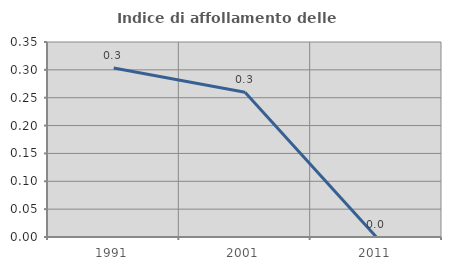
| Category | Indice di affollamento delle abitazioni  |
|---|---|
| 1991.0 | 0.303 |
| 2001.0 | 0.26 |
| 2011.0 | 0 |